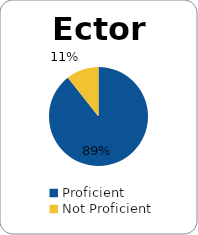
| Category | Series 0 |
|---|---|
| Proficient | 0.894 |
| Not Proficient | 0.106 |